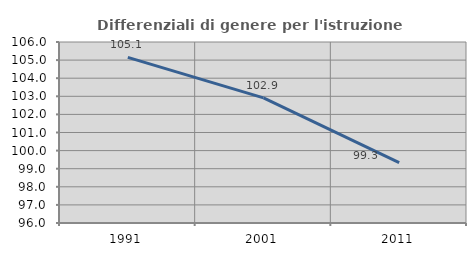
| Category | Differenziali di genere per l'istruzione superiore |
|---|---|
| 1991.0 | 105.148 |
| 2001.0 | 102.913 |
| 2011.0 | 99.334 |